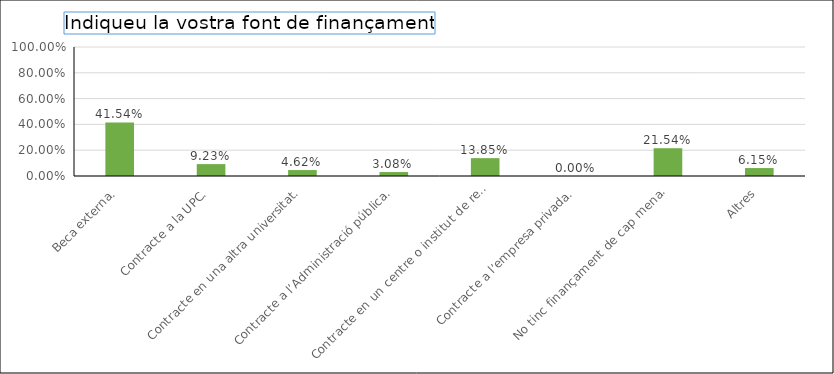
| Category | Series 0 |
|---|---|
| Beca externa. | 0.415 |
| Contracte a la UPC. | 0.092 |
| Contracte en una altra universitat. | 0.046 |
| Contracte a l’Administració pública. | 0.031 |
| Contracte en un centre o institut de recerca diferent de la UPC. | 0.138 |
| Contracte a l’empresa privada. | 0 |
| No tinc finançament de cap mena. | 0.215 |
| Altres | 0.062 |